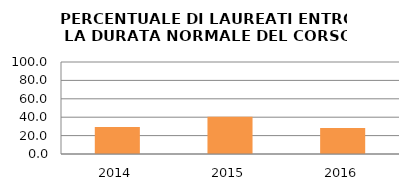
| Category | 2014 2015 2016 |
|---|---|
| 2014.0 | 29.258 |
| 2015.0 | 40.541 |
| 2016.0 | 28.141 |